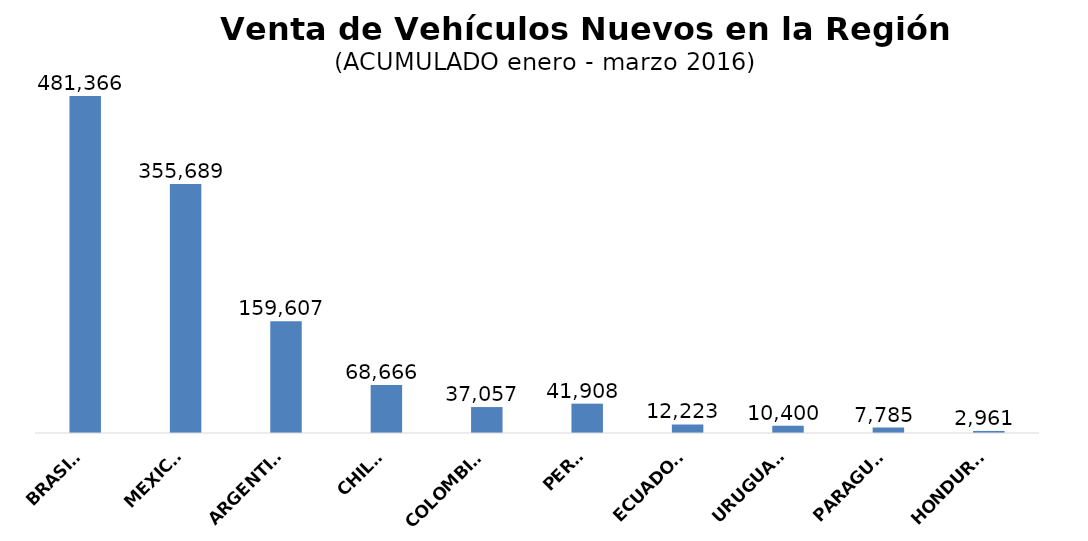
| Category | ACUMULADO 
enero - marzo 2016 |
|---|---|
|  BRASIL  | 481366 |
|  MEXICO  | 355689 |
|  ARGENTINA  | 159607 |
|  CHILE  | 68666 |
|  COLOMBIA  | 37057 |
|  PERU  | 41908 |
|  ECUADOR  | 12223 |
|  URUGUAY  | 10400 |
|  PARAGUAY  | 7785 |
|  HONDURAS  | 2961 |